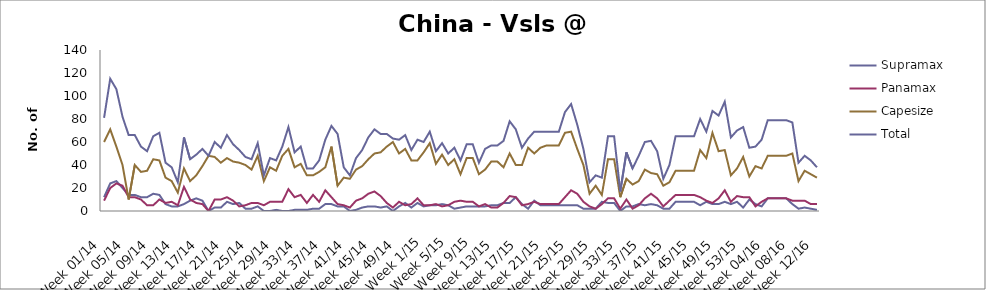
| Category | Supramax | Panamax | Capesize | Total |
|---|---|---|---|---|
| Week 01/14 | 12 | 9 | 60 | 81 |
| Week 02/14 | 24 | 20 | 71 | 115 |
| Week 03/14 | 26 | 24 | 56 | 106 |
| Week 04/14 | 20 | 22 | 40 | 82 |
| Week 05/14 | 14 | 12 | 10 | 66 |
| Week 06/14 | 14 | 12 | 40 | 66 |
| Week 07/14 | 12 | 10 | 34 | 56 |
| Week 08/14 | 12 | 5 | 35 | 52 |
| Week 09/14 | 15 | 5 | 45 | 65 |
| Week 10/14 | 14 | 10 | 44 | 68 |
| Week 11/14 | 6 | 7 | 29 | 42 |
| Week 12/14 | 4 | 8 | 26 | 38 |
| Week 13/14 | 4 | 5 | 16 | 25 |
| Week 14/14 | 6 | 21 | 37 | 64 |
| Week 15/14 | 9 | 10 | 26 | 45 |
| Week 16/14 | 11 | 7 | 31 | 49 |
| Week 17/14 | 9 | 6 | 39 | 54 |
| Week 18/14 | 0 | 0 | 48 | 48 |
| Week 19/14 | 3 | 10 | 47 | 60 |
| Week 20/14 | 3 | 10 | 42 | 55 |
| Week 21/14 | 8 | 12 | 46 | 66 |
| Week 22/14 | 6 | 9 | 43 | 58 |
| Week 23/14 | 7 | 4 | 42 | 53 |
| Week 24/14 | 2 | 5 | 40 | 47 |
| Week 25/14 | 2 | 7 | 36 | 45 |
| Week 26/14 | 4 | 7 | 48 | 59 |
| Week 27/14 | 0 | 5 | 26 | 31 |
| Week 28/14 | 0 | 8 | 38 | 46 |
| Week 29/14 | 1 | 8 | 35 | 44 |
| Week 30/14 | 0 | 8 | 48 | 56 |
| Week 31/14 | 0 | 19 | 54 | 73 |
| Week 32/14 | 1 | 12 | 38 | 51 |
| Week 33/14 | 1 | 14 | 41 | 56 |
| Week 34/14 | 1 | 7 | 31 | 37 |
| Week 35/14 | 2 | 14 | 31 | 37 |
| Week 36/14 | 2 | 8 | 34 | 44 |
| Week 37/14 | 6 | 18 | 38 | 62 |
| Week 38/14 | 6 | 12 | 56 | 74 |
| Week 39/14 | 4 | 6 | 22 | 67 |
| Week 40/14 | 4 | 5 | 29 | 38 |
| Week 41/14 | 0 | 3 | 28 | 31 |
| Week 42/14 | 1 | 9 | 36 | 46 |
| Week 43/14 | 3 | 11 | 39 | 53 |
| Week 44/14 | 4 | 15 | 45 | 64 |
| Week 45/14 | 4 | 17 | 50 | 71 |
| Week 46/14 | 3 | 13 | 51 | 67 |
| Week 47/14 | 4 | 7 | 56 | 67 |
| Week 48/14 | 0 | 3 | 60 | 63 |
| Week 49/14 | 4 | 8 | 50 | 62 |
| Week 50/14 | 7 | 5 | 54 | 66 |
| Week 51/14 | 3 | 6 | 44 | 53 |
| Week 52/14 | 7 | 11 | 44 | 62 |
| Week 1/15 | 4 | 5 | 51 | 60 |
| Week 2/15 | 5 | 5 | 59 | 69 |
| Week 3/15 | 5 | 6 | 41 | 52 |
| Week 4/15 | 6 | 4 | 49 | 59 |
| Week 5/15 | 5 | 5 | 40 | 50 |
| Week 6/15 | 2 | 8 | 45 | 55 |
| Week 7/15 | 3 | 9 | 32 | 44 |
| Week 8/15 | 4 | 8 | 46 | 58 |
| Week 9/15 | 4 | 8 | 46 | 58 |
| Week 10/15 | 4 | 4 | 32 | 42 |
| Week 11/15 | 4 | 6 | 36 | 54 |
| Week 12/15 | 5 | 3 | 43 | 57 |
| Week 13/15 | 5 | 3 | 43 | 57 |
| Week 14/15 | 7 | 7 | 38 | 61 |
| Week 15/15 | 7 | 13 | 50 | 78 |
| Week 16/15 | 12 | 12 | 40 | 71 |
| Week 17/15 | 6 | 5 | 40 | 55 |
| Week 18/15 | 2 | 6 | 55 | 63 |
| Week 19/15 | 9 | 8 | 50 | 69 |
| Week 20/15 | 5 | 6 | 55 | 69 |
| Week 21/15 | 5 | 6 | 57 | 69 |
| Week 22/15 | 5 | 6 | 57 | 69 |
| Week 23/15 | 5 | 6 | 57 | 69 |
| Week 24/15 | 5 | 12 | 68 | 86 |
| Week 25/15 | 5 | 18 | 69 | 93 |
| Week 26/15 | 5 | 15 | 54 | 75 |
| Week 27/15 | 2 | 8 | 40 | 54 |
| Week 28/15 | 2 | 4 | 15 | 25 |
| Week 29/15 | 2 | 2 | 22 | 31 |
| Week 30/15 | 8 | 6 | 14 | 29 |
| Week 31/15 | 7 | 11 | 45 | 65 |
| Week 32/15 | 7 | 11 | 45 | 65 |
| Week 33/15 | 0 | 2 | 12 | 17 |
| Week 34/15 | 4 | 10 | 28 | 51 |
| Week 35/15 | 4 | 2 | 23 | 37 |
| Week 36/15 | 6 | 5 | 26 | 48 |
| Week 37/15 | 5 | 11 | 36 | 60 |
| Week 38/15 | 6 | 15 | 33 | 61 |
| Week 39/15 | 5 | 11 | 32 | 52 |
| Week 40/15 | 2 | 4 | 22 | 28 |
| Week 41/15 | 2 | 9 | 25 | 40 |
| Week 42/15 | 8 | 14 | 35 | 65 |
| Week 43/15 | 8 | 14 | 35 | 65 |
| Week 44/15 | 8 | 14 | 35 | 65 |
| Week 45/15 | 8 | 14 | 35 | 65 |
| Week 46/15 | 5 | 12 | 53 | 80 |
| Week 47/15 | 8 | 9 | 46 | 69 |
| Week 48/15 | 6 | 7 | 68 | 87 |
| Week 49/15 | 6 | 11 | 52 | 83 |
| Week 50/15 | 8 | 18 | 53 | 95 |
| Week 51/15 | 6 | 8 | 31 | 64 |
| Week 52/15 | 8 | 13 | 37 | 70 |
| Week 53/15 | 3 | 12 | 47 | 73 |
| Week 01/16 | 10 | 12 | 30 | 55 |
| Week 02/16 | 6 | 4 | 39 | 56 |
| Week 03/16 | 4 | 8 | 37 | 62 |
| Week 04/16 | 11 | 11 | 48 | 79 |
| Week 05/16 | 11 | 11 | 48 | 79 |
| Week 06/16 | 11 | 11 | 48 | 79 |
| Week 07/16 | 11 | 11 | 48 | 79 |
| Week 08/16 | 6 | 9 | 50 | 77 |
| Week 09/16 | 2 | 9 | 26 | 42 |
| Week 10/16 | 3 | 9 | 35 | 48 |
| Week 11/16 | 2 | 6 | 32 | 44 |
| Week 12/16 | 1 | 6 | 29 | 38 |